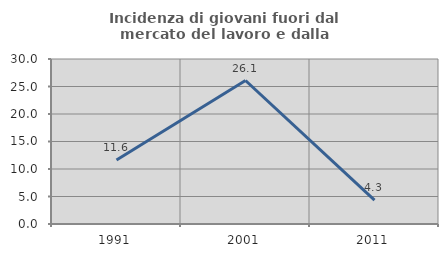
| Category | Incidenza di giovani fuori dal mercato del lavoro e dalla formazione  |
|---|---|
| 1991.0 | 11.628 |
| 2001.0 | 26.087 |
| 2011.0 | 4.348 |